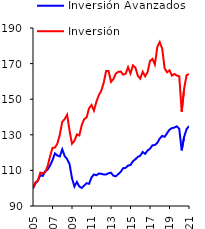
| Category | Inversión Avanzados | Inversión Emergentes |
|---|---|---|
| 2005-03-31 | 100 | 100 |
| 2005-06-30 | 102.669 | 103.248 |
| 2005-09-30 | 104.258 | 104.155 |
| 2005-12-31 | 107.341 | 108.758 |
| 2006-03-31 | 106.867 | 108.432 |
| 2006-06-30 | 109.475 | 109.016 |
| 2006-09-30 | 110.48 | 112.307 |
| 2006-12-31 | 112.709 | 117.948 |
| 2007-03-31 | 115.723 | 122.68 |
| 2007-06-30 | 119.531 | 122.827 |
| 2007-09-30 | 118.367 | 125.025 |
| 2007-12-31 | 117.832 | 130.009 |
| 2008-03-31 | 121.819 | 137.299 |
| 2008-06-30 | 118.038 | 138.84 |
| 2008-09-30 | 116.359 | 141.224 |
| 2008-12-31 | 113.529 | 132.209 |
| 2009-03-31 | 105.541 | 124.98 |
| 2009-06-30 | 100.991 | 126.598 |
| 2009-09-30 | 103.514 | 130.218 |
| 2009-12-31 | 100.972 | 129.606 |
| 2010-03-31 | 100.138 | 135.445 |
| 2010-06-30 | 101.516 | 138.794 |
| 2010-09-30 | 102.837 | 139.821 |
| 2010-12-31 | 102.466 | 144.902 |
| 2011-03-31 | 106.043 | 146.739 |
| 2011-06-30 | 107.718 | 143.581 |
| 2011-09-30 | 107.243 | 148.546 |
| 2011-12-31 | 108.236 | 152.275 |
| 2012-03-31 | 108.04 | 154.671 |
| 2012-06-30 | 107.72 | 159.131 |
| 2012-09-30 | 107.738 | 165.878 |
| 2012-12-31 | 108.406 | 165.849 |
| 2013-03-31 | 108.7 | 159.752 |
| 2013-06-30 | 106.989 | 161.332 |
| 2013-09-30 | 106.732 | 164.421 |
| 2013-12-31 | 107.942 | 165.364 |
| 2014-03-31 | 109.2 | 165.532 |
| 2014-06-30 | 111.249 | 163.76 |
| 2014-09-30 | 111.415 | 164.305 |
| 2014-12-31 | 112.699 | 167.994 |
| 2015-03-31 | 113.066 | 164.456 |
| 2015-06-30 | 115.157 | 169.007 |
| 2015-09-30 | 116.259 | 167.806 |
| 2015-12-31 | 117.593 | 163.152 |
| 2016-03-31 | 118.227 | 161.563 |
| 2016-06-30 | 120.355 | 165.445 |
| 2016-09-30 | 119.298 | 162.837 |
| 2016-12-31 | 121.163 | 165.229 |
| 2017-03-31 | 122.176 | 171.421 |
| 2017-06-30 | 124.124 | 172.656 |
| 2017-09-30 | 124.223 | 169.516 |
| 2017-12-31 | 125.465 | 179.312 |
| 2018-03-31 | 127.922 | 182.127 |
| 2018-06-30 | 129.388 | 178.428 |
| 2018-09-30 | 128.857 | 167.327 |
| 2018-12-31 | 130.912 | 165.101 |
| 2019-03-31 | 132.871 | 166.232 |
| 2019-06-30 | 133.756 | 163.284 |
| 2019-09-30 | 134.055 | 164.143 |
| 2019-12-31 | 134.78 | 163.301 |
| 2020-03-31 | 133.341 | 162.888 |
| 2020-06-30 | 121.301 | 142.988 |
| 2020-09-30 | 128.817 | 155.894 |
| 2020-12-31 | 133.165 | 163.465 |
| 2021-03-31 | 134.88 | 164.105 |